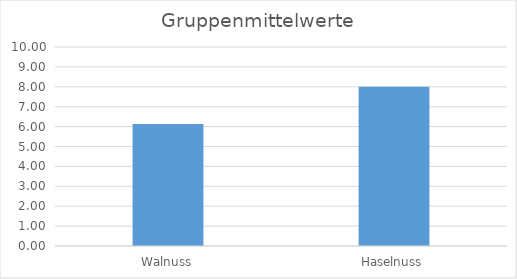
| Category | Series 0 |
|---|---|
| Walnuss | 6.125 |
| Haselnuss | 8 |